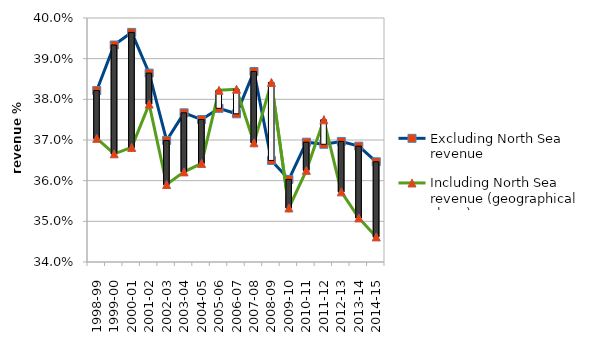
| Category | Excluding North Sea revenue | Including North Sea revenue (geographical share) |
|---|---|---|
| 1998-99 | 0.382 | 0.37 |
| 1999-00 | 0.393 | 0.367 |
| 2000-01 | 0.396 | 0.368 |
| 2001-02 | 0.386 | 0.379 |
| 2002-03 | 0.37 | 0.359 |
| 2003-04 | 0.377 | 0.362 |
| 2004-05 | 0.375 | 0.364 |
| 2005-06 | 0.378 | 0.382 |
| 2006-07 | 0.376 | 0.382 |
| 2007-08 | 0.387 | 0.369 |
| 2008-09 | 0.365 | 0.384 |
| 2009-10 | 0.36 | 0.353 |
| 2010-11 | 0.369 | 0.363 |
| 2011-12 | 0.369 | 0.375 |
| 2012-13 | 0.37 | 0.357 |
| 2013-14 | 0.368 | 0.351 |
| 2014-15 | 0.365 | 0.346 |